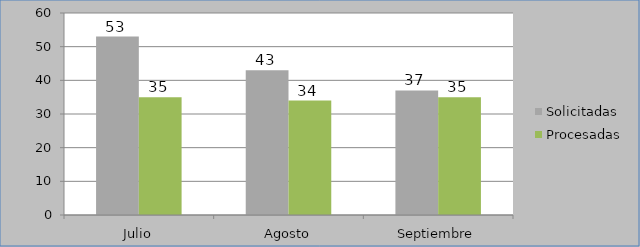
| Category | Solicitadas | Procesadas |
|---|---|---|
| Julio | 53 | 35 |
| Agosto | 43 | 34 |
| Septiembre | 37 | 35 |